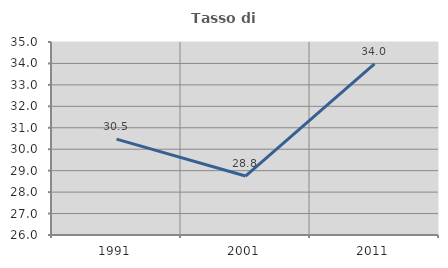
| Category | Tasso di occupazione   |
|---|---|
| 1991.0 | 30.47 |
| 2001.0 | 28.75 |
| 2011.0 | 33.985 |